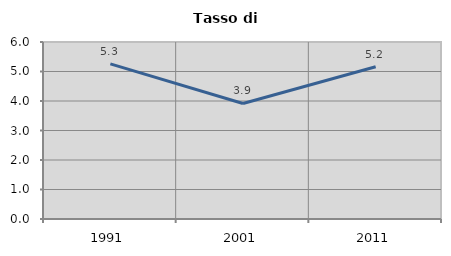
| Category | Tasso di disoccupazione   |
|---|---|
| 1991.0 | 5.26 |
| 2001.0 | 3.917 |
| 2011.0 | 5.163 |